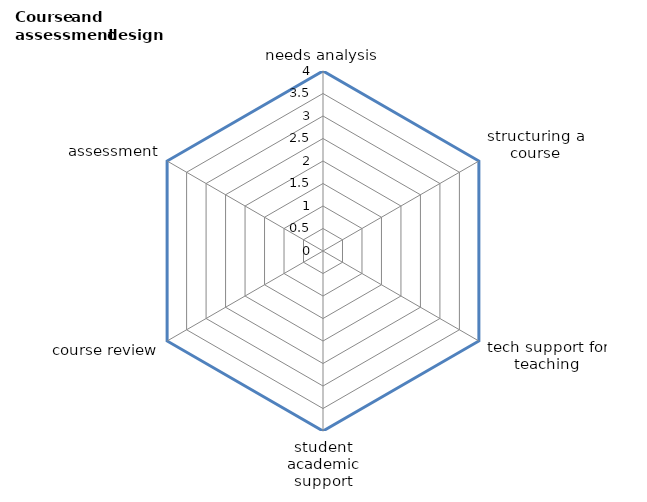
| Category | Series 0 | Series 1 |
|---|---|---|
| needs analysis | 4 | 0 |
| structuring a course | 4 | 0 |
| tech support for teaching | 4 | 0 |
| student academic support | 4 | 0 |
| course review | 4 | 0 |
| assessment | 4 | 0 |